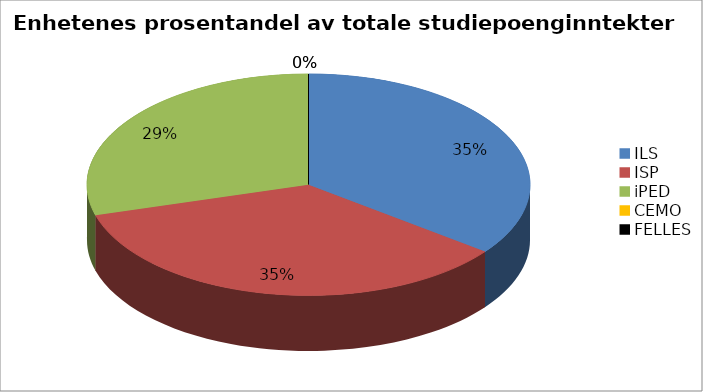
| Category | Series 0 |
|---|---|
| ILS | 14733733.333 |
| ISP | 14678000 |
| iPED | 12289733.333 |
| CEMO | 0 |
| FELLES | 0 |